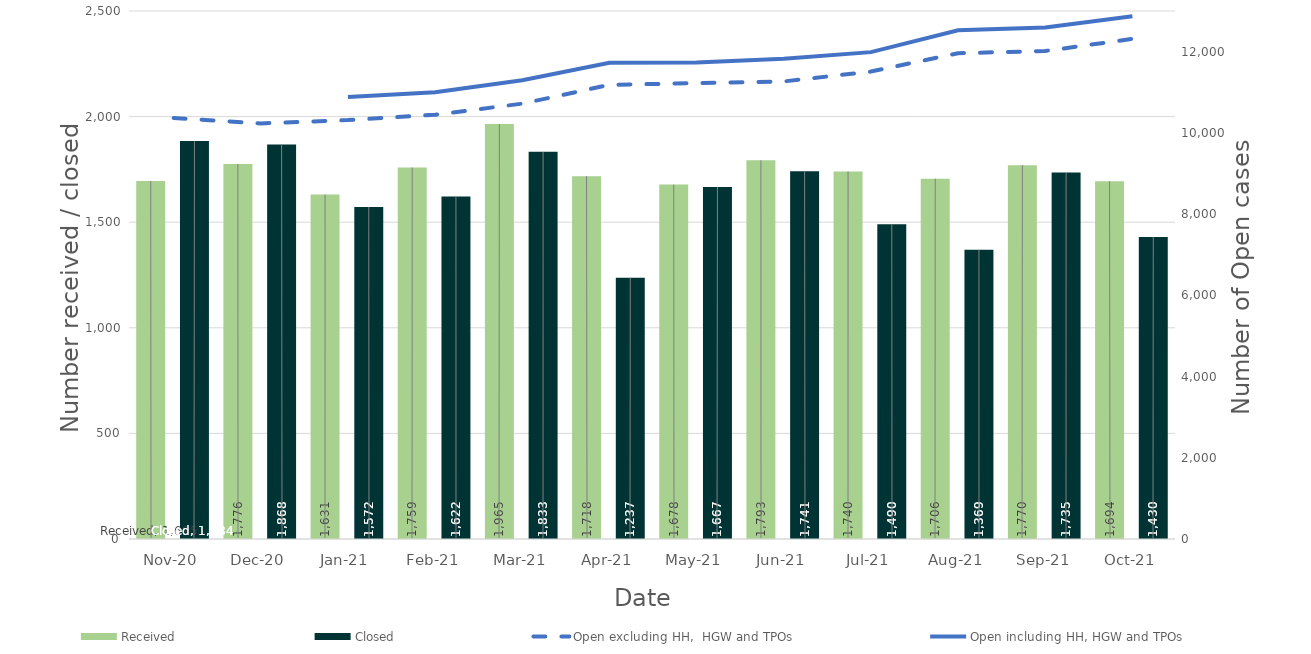
| Category | Received | Closed |
|---|---|---|
| Nov-20 | 1695 | 1884 |
| Dec-20 | 1776 | 1868 |
| Jan-21 | 1631 | 1572 |
| Feb-21 | 1759 | 1622 |
| Mar-21 | 1965 | 1833 |
| Apr-21 | 1718 | 1237 |
| May-21 | 1678 | 1667 |
| Jun-21 | 1793 | 1741 |
| Jul-21 | 1740 | 1490 |
| Aug-21 | 1706 | 1369 |
| Sep-21 | 1770 | 1735 |
| Oct-21 | 1694 | 1430 |